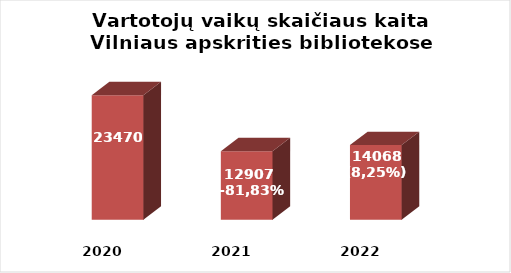
| Category | Series 0 |
|---|---|
| 2020.0 | 23470 |
| 2021.0 | 12907 |
| 2022.0 | 14068 |